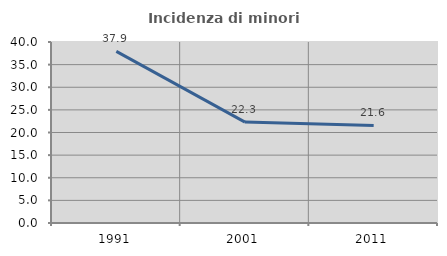
| Category | Incidenza di minori stranieri |
|---|---|
| 1991.0 | 37.931 |
| 2001.0 | 22.302 |
| 2011.0 | 21.555 |